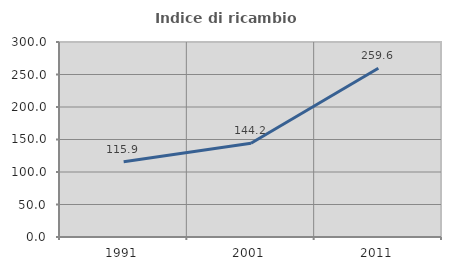
| Category | Indice di ricambio occupazionale  |
|---|---|
| 1991.0 | 115.912 |
| 2001.0 | 144.156 |
| 2011.0 | 259.619 |